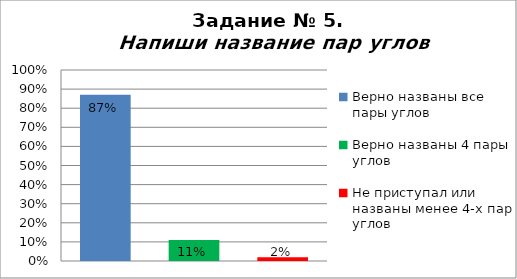
| Category | Напиши название пар углов |
|---|---|
| Верно названы все пары углов | 0.87 |
| Верно названы 4 пары углов | 0.11 |
| Не приступал или названы менее 4-х пар углов | 0.02 |